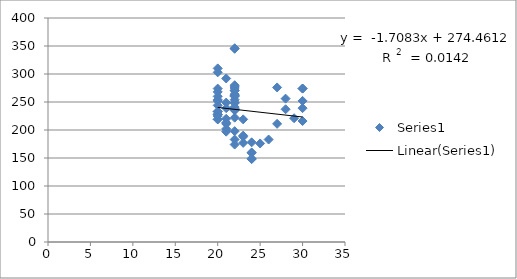
| Category | Series 0 |
|---|---|
| 20.0 | 303 |
| 20.0 | 219 |
| 20.0 | 274 |
| 20.0 | 260 |
| 20.0 | 228 |
| 20.0 | 268 |
| 20.0 | 228 |
| 21.0 | 202 |
| 21.0 | 213 |
| 21.0 | 197 |
| 21.0 | 220 |
| 21.0 | 249 |
| 22.0 | 198 |
| 22.0 | 183 |
| 23.0 | 177 |
| 25.0 | 176 |
| 26.0 | 183 |
| 20.0 | 310 |
| 20.0 | 219 |
| 20.0 | 254 |
| 20.0 | 233 |
| 20.0 | 233 |
| 20.0 | 252 |
| 20.0 | 244 |
| 20.0 | 225 |
| 21.0 | 239 |
| 21.0 | 211 |
| 22.0 | 174 |
| 23.0 | 188 |
| 27.0 | 276 |
| 28.0 | 237 |
| 29.0 | 221 |
| 30.0 | 252 |
| 30.0 | 274 |
| 21.0 | 292 |
| 22.0 | 270 |
| 22.0 | 235 |
| 22.0 | 222 |
| 22.0 | 277 |
| 22.0 | 346 |
| 22.0 | 262 |
| 22.0 | 264 |
| 22.0 | 237 |
| 23.0 | 219 |
| 23.0 | 190 |
| 24.0 | 178 |
| 24.0 | 160 |
| 30.0 | 239 |
| 30.0 | 274 |
| 22.0 | 271 |
| 22.0 | 238 |
| 22.0 | 260 |
| 22.0 | 249 |
| 22.0 | 280 |
| 22.0 | 275 |
| 22.0 | 241 |
| 22.0 | 261 |
| 22.0 | 345 |
| 22.0 | 236 |
| 22.0 | 248 |
| 22.0 | 254 |
| 24.0 | 148 |
| 24.0 | 159 |
| 24.0 | 149 |
| 27.0 | 211 |
| 28.0 | 256 |
| 30.0 | 216 |